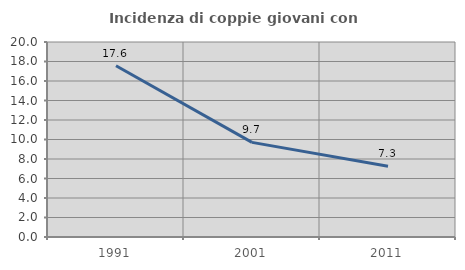
| Category | Incidenza di coppie giovani con figli |
|---|---|
| 1991.0 | 17.564 |
| 2001.0 | 9.703 |
| 2011.0 | 7.262 |